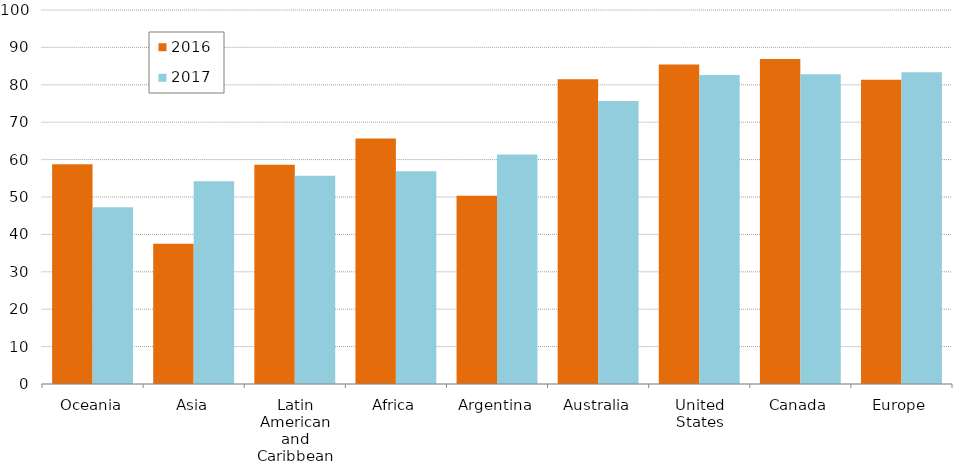
| Category | 2016 | 2017 |
|---|---|---|
| Oceania | 58.752 | 47.27 |
| Asia | 37.467 | 54.23 |
| Latin American and Caribbean | 58.624 | 55.66 |
| Africa | 65.668 | 56.86 |
| Argentina | 50.326 | 61.38 |
| Australia | 81.505 | 75.65 |
| United States | 85.423 | 82.61 |
| Canada | 86.911 | 82.825 |
| Europe | 81.354 | 83.375 |